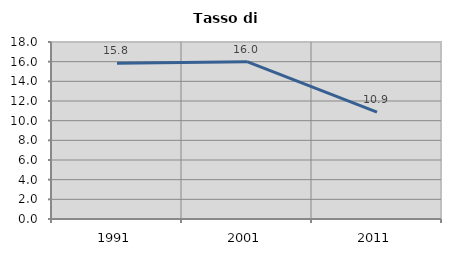
| Category | Tasso di disoccupazione   |
|---|---|
| 1991.0 | 15.844 |
| 2001.0 | 15.999 |
| 2011.0 | 10.877 |